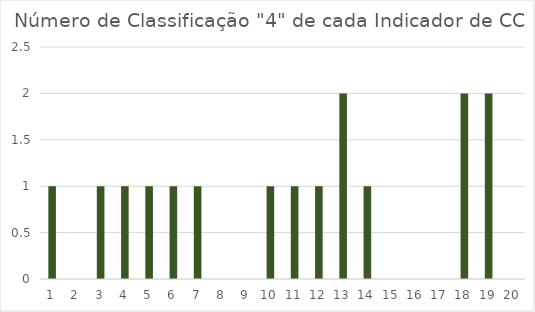
| Category | Series 0 |
|---|---|
| 0 | 1 |
| 1 | 0 |
| 2 | 1 |
| 3 | 1 |
| 4 | 1 |
| 5 | 1 |
| 6 | 1 |
| 7 | 0 |
| 8 | 0 |
| 9 | 1 |
| 10 | 1 |
| 11 | 1 |
| 12 | 2 |
| 13 | 1 |
| 14 | 0 |
| 15 | 0 |
| 16 | 0 |
| 17 | 2 |
| 18 | 2 |
| 19 | 0 |